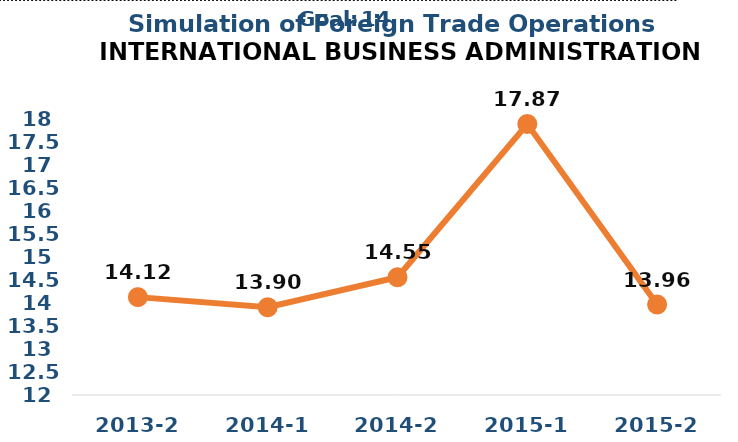
| Category | Series 0 |
|---|---|
| 2013-2 | 14.12 |
| 2014-1 | 13.9 |
| 2014-2 | 14.55 |
| 2015-1 | 17.87 |
| 2015-2 | 13.96 |